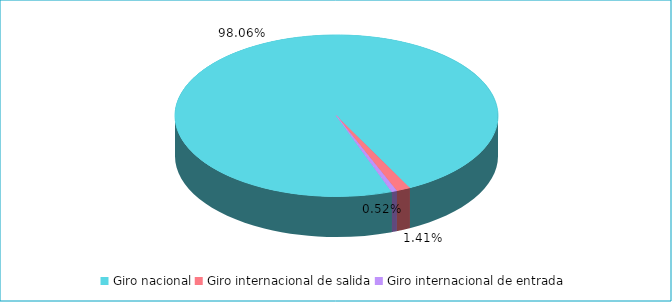
| Category | Series 0 |
|---|---|
| Giro nacional | 0.981 |
| Giro internacional de salida | 0.014 |
| Giro internacional de entrada | 0.005 |